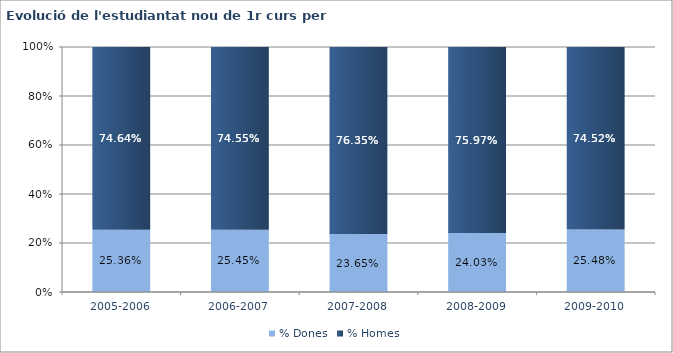
| Category | % Dones | % Homes |
|---|---|---|
| 2005-2006 | 0.254 | 0.746 |
| 2006-2007 | 0.255 | 0.745 |
| 2007-2008 | 0.237 | 0.763 |
| 2008-2009 | 0.24 | 0.76 |
| 2009-2010 | 0.255 | 0.745 |